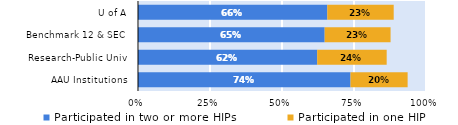
| Category | Participated in two or more HIPs | Participated in one HIP |
|---|---|---|
| AAU Institutions | 0.738 | 0.198 |
| Research-Public Univ | 0.622 | 0.241 |
| Benchmark 12 & SEC | 0.648 | 0.229 |
| U of A | 0.657 | 0.231 |